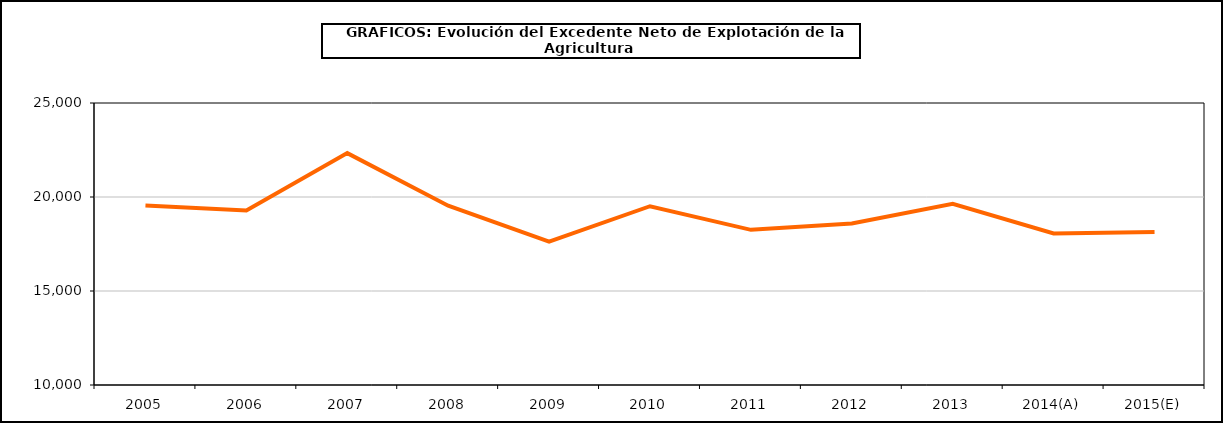
| Category | excedente neto de explotacion |
|---|---|
| 2005 | 19553.083 |
| 2006 | 19287.489 |
| 2007 | 22333.308 |
| 2008 | 19538.087 |
| 2009 | 17624.014 |
| 2010 | 19508.768 |
| 2011 | 18252.686 |
| 2012 | 18589.082 |
| 2013 | 19635.617 |
| 2014(A) | 18063.743 |
| 2015(E) | 18138.48 |